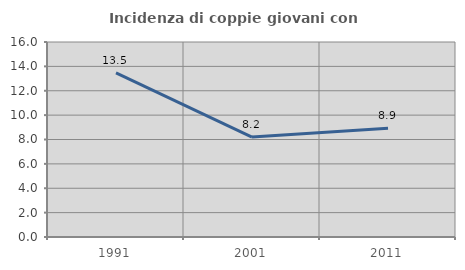
| Category | Incidenza di coppie giovani con figli |
|---|---|
| 1991.0 | 13.462 |
| 2001.0 | 8.197 |
| 2011.0 | 8.929 |